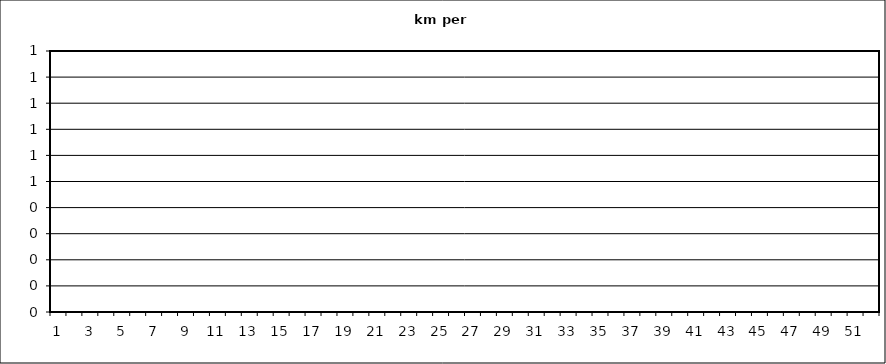
| Category | Series 0 |
|---|---|
| 0 | 0 |
| 1 | 0 |
| 2 | 0 |
| 3 | 0 |
| 4 | 0 |
| 5 | 0 |
| 6 | 0 |
| 7 | 0 |
| 8 | 0 |
| 9 | 0 |
| 10 | 0 |
| 11 | 0 |
| 12 | 0 |
| 13 | 0 |
| 14 | 0 |
| 15 | 0 |
| 16 | 0 |
| 17 | 0 |
| 18 | 0 |
| 19 | 0 |
| 20 | 0 |
| 21 | 0 |
| 22 | 0 |
| 23 | 0 |
| 24 | 0 |
| 25 | 0 |
| 26 | 0 |
| 27 | 0 |
| 28 | 0 |
| 29 | 0 |
| 30 | 0 |
| 31 | 0 |
| 32 | 0 |
| 33 | 0 |
| 34 | 0 |
| 35 | 0 |
| 36 | 0 |
| 37 | 0 |
| 38 | 0 |
| 39 | 0 |
| 40 | 0 |
| 41 | 0 |
| 42 | 0 |
| 43 | 0 |
| 44 | 0 |
| 45 | 0 |
| 46 | 0 |
| 47 | 0 |
| 48 | 0 |
| 49 | 0 |
| 50 | 0 |
| 51 | 0 |